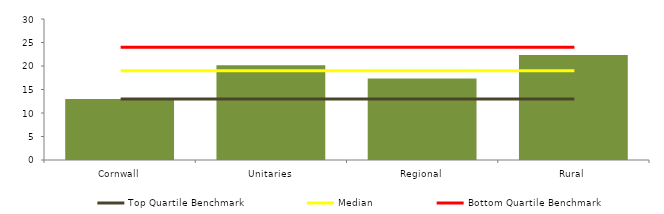
| Category | Block Data |
|---|---|
| Cornwall | 13 |
| Unitaries | 20.175 |
| Regional | 17.364 |
|  Rural  | 22.333 |